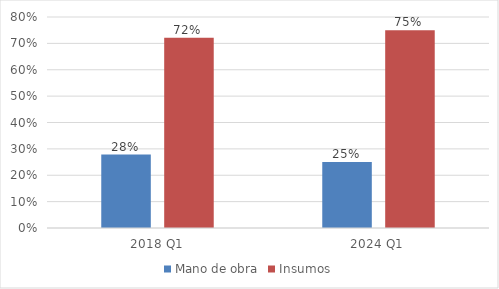
| Category | Mano de obra | Insumos |
|---|---|---|
| 2018 Q1 | 0.279 | 0.721 |
| 2024 Q1 | 0.25 | 0.75 |